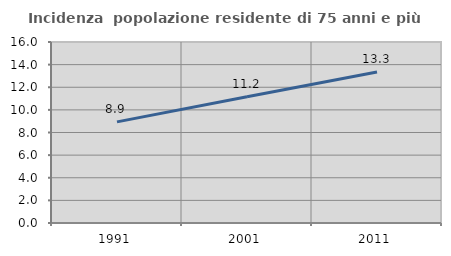
| Category | Incidenza  popolazione residente di 75 anni e più |
|---|---|
| 1991.0 | 8.938 |
| 2001.0 | 11.166 |
| 2011.0 | 13.343 |